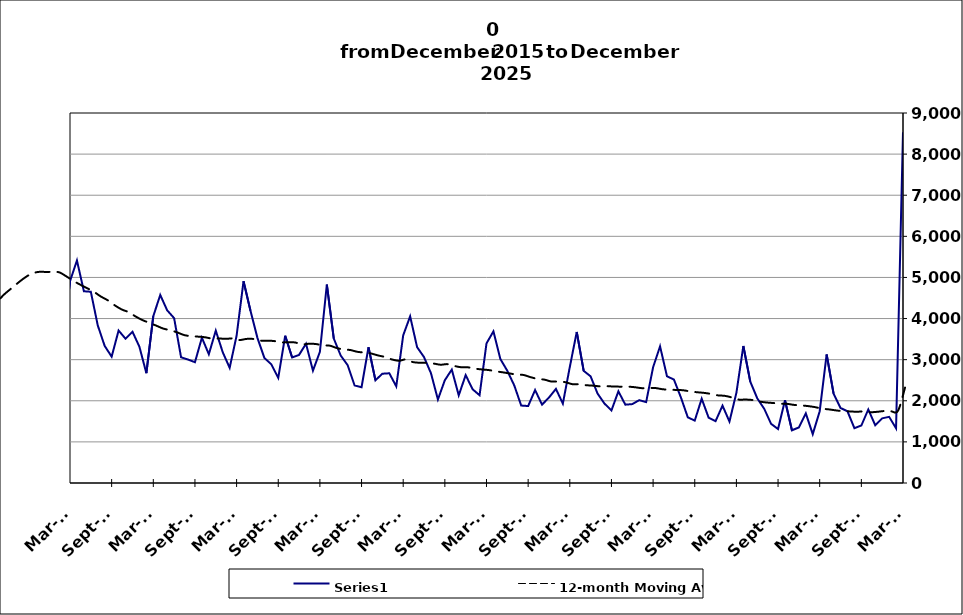
| Category | Series 0 |
|---|---|
| 2005-05-31 | 3131 |
| 2005-06-30 | 2953 |
| 2005-07-31 | 2452 |
| 2005-08-31 | 1842 |
| 2005-09-30 | 1444 |
| 2005-10-31 | 2141 |
| 2005-11-30 | 1626 |
| 2005-12-31 | 1998 |
| 2006-01-31 | 1588 |
| 2006-02-28 | 1445 |
| 2006-03-31 | 1949 |
| 2006-04-30 | 2959 |
| 2006-05-31 | 2381 |
| 2006-06-30 | 2220 |
| 2006-07-31 | 2123 |
| 2006-08-31 | 1525 |
| 2006-09-30 | 1615 |
| 2006-10-31 | 1860 |
| 2006-11-30 | 1507 |
| 2006-12-31 | 1965 |
| 2007-01-31 | 2023 |
| 2007-02-28 | 1616 |
| 2007-03-31 | 2671 |
| 2007-04-30 | 3721 |
| 2007-05-31 | 2286 |
| 2007-06-30 | 3372 |
| 2007-07-30 | 2459 |
| 2007-08-31 | 1980 |
| 2007-09-30 | 2331 |
| 2007-10-31 | 2490 |
| 2007-11-15 | 1970 |
| 2007-12-15 09:36:00 | 2318 |
| 2008-01-14 19:12:00 | 2557 |
| 2008-02-14 04:48:00 | 2676 |
| 2008-03-15 14:24:00 | 3345 |
| 2008-04-15 | 4771 |
| 2008-05-15 09:36:00 | 3529 |
| 2008-06-14 19:12:00 | 4044 |
| 2008-07-15 04:48:00 | 3468 |
| 2008-08-14 14:24:00 | 2936 |
| 2008-09-14 | 3327 |
| 2008-10-14 09:36:00 | 4398 |
| 2008-11-13 19:12:00 | 4288 |
| 2008-12-14 04:48:00 | 4919 |
| 2009-01-13 14:24:00 | 4529 |
| 2009-02-13 | 4588 |
| 2009-03-15 09:36:00 | 6230 |
| 2009-04-14 19:12:00 | 6528 |
| 2009-05-15 04:48:00 | 5710 |
| 2009-06-14 14:24:00 | 5729 |
| 2009-07-15 | 5181 |
| 2009-08-14 09:36:00 | 4471 |
| 2009-09-13 19:12:00 | 4514 |
| 2009-10-14 04:48:00 | 4928 |
| 2009-11-13 14:24:00 | 4288 |
| 2009-12-14 | 4919 |
| 2010-01-13 09:36:00 | 4406 |
| 2010-02-12 19:12:00 | 3451 |
| 2010-03-15 04:48:00 | 4910 |
| 2010-04-14 14:24:00 | 5413 |
| 2010-05-15 | 4664 |
| 2010-06-14 09:36:00 | 4652 |
| 2010-07-14 19:12:00 | 3833 |
| 2010-08-14 04:48:00 | 3333 |
| 2010-09-13 14:24:00 | 3073 |
| 2010-10-14 | 3708 |
| 2010-11-13 09:36:00 | 3510 |
| 2010-12-13 19:12:00 | 3680 |
| 2011-01-13 04:48:00 | 3314 |
| 2011-02-12 14:24:00 | 2671 |
| 2011-03-15 | 4059 |
| 2011-04-14 09:36:00 | 4574 |
| 2011-05-14 19:12:00 | 4200 |
| 2011-06-14 04:48:00 | 4010 |
| 2011-07-14 14:24:00 | 3058 |
| 2011-08-14 | 3003 |
| 2011-09-13 09:36:00 | 2938 |
| 2011-10-13 19:12:00 | 3534 |
| 2011-11-13 04:48:00 | 3132 |
| 2011-12-13 14:24:00 | 3706 |
| 2012-01-13 | 3182 |
| 2012-02-12 09:36:00 | 2802 |
| 2012-03-13 19:12:00 | 3584 |
| 2012-04-13 04:48:00 | 4909 |
| 2012-05-13 14:24:00 | 4188 |
| 2012-06-13 | 3531 |
| 2012-07-13 09:36:00 | 3044 |
| 2012-08-12 19:12:00 | 2885 |
| 2012-09-12 04:48:00 | 2556 |
| 2012-10-12 14:24:00 | 3582 |
| 2012-11-12 | 3054 |
| 2012-12-12 09:36:00 | 3117 |
| 2013-01-11 19:12:00 | 3385 |
| 2013-02-11 04:48:00 | 2732 |
| 2013-03-13 14:24:00 | 3189 |
| 2013-04-13 | 4828 |
| 2013-05-13 09:36:00 | 3513 |
| 2013-06-12 19:12:00 | 3099 |
| 2013-07-13 04:48:00 | 2867 |
| 2013-08-12 14:24:00 | 2371 |
| 2013-09-12 | 2330 |
| 2013-10-12 09:36:00 | 3301 |
| 2013-11-11 19:12:00 | 2499 |
| 2013-12-12 04:48:00 | 2658 |
| 2014-01-11 14:24:00 | 2669 |
| 2014-02-11 | 2351 |
| 2014-03-13 09:36:00 | 3592 |
| 2014-04-12 19:12:00 | 4054 |
| 2014-05-13 04:48:00 | 3305 |
| 2014-06-12 14:24:00 | 3062 |
| 2014-07-13 | 2671 |
| 2014-08-12 09:36:00 | 2031 |
| 2014-09-11 19:12:00 | 2501 |
| 2014-10-12 04:48:00 | 2759 |
| 2014-11-11 14:24:00 | 2132 |
| 2014-12-12 | 2624 |
| 2015-01-11 09:36:00 | 2280 |
| 2015-02-10 19:12:00 | 2135 |
| 2015-03-13 04:48:00 | 3396 |
| 2015-04-12 14:24:00 | 3689 |
| 2015-05-13 | 3015 |
| 2015-06-12 09:36:00 | 2729 |
| 2015-07-12 19:12:00 | 2373 |
| 2015-08-12 04:48:00 | 1884 |
| 2015-09-11 14:24:00 | 1872 |
| 2015-10-12 | 2261 |
| 2015-11-11 09:36:00 | 1906 |
| 2015-12-11 19:12:00 | 2079 |
| 2016-01-11 04:48:00 | 2289 |
| 2016-02-10 14:24:00 | 1931 |
| 2016-03-12 | 2822 |
| 2016-04-11 09:36:00 | 3674 |
| 2016-05-11 19:12:00 | 2728 |
| 2016-06-11 04:48:00 | 2594 |
| 2016-07-11 14:24:00 | 2175 |
| 2016-08-11 | 1931 |
| 2016-09-10 09:36:00 | 1765 |
| 2016-10-10 19:12:00 | 2230 |
| 2016-11-10 04:48:00 | 1905 |
| 2016-12-10 14:24:00 | 1919 |
| 2017-01-10 | 2015 |
| 2017-02-09 09:36:00 | 1968 |
| 2017-03-11 19:12:00 | 2817 |
| 2017-04-11 04:48:00 | 3325 |
| 2017-05-11 14:24:00 | 2596 |
| 2017-06-11 | 2516 |
| 2017-07-11 09:36:00 | 2084 |
| 2017-08-10 19:12:00 | 1597 |
| 2017-09-10 04:48:00 | 1518 |
| 2017-10-10 14:24:00 | 2050 |
| 2017-11-10 | 1589 |
| 2017-12-10 09:36:00 | 1505 |
| 2018-01-09 19:12:00 | 1882 |
| 2018-02-09 04:48:00 | 1495 |
| 2018-03-11 14:24:00 | 2194 |
| 2018-04-11 | 3332 |
| 2018-05-11 09:36:00 | 2466 |
| 2018-06-10 19:12:00 | 2063 |
| 2018-07-11 04:48:00 | 1809 |
| 2018-08-10 14:24:00 | 1440 |
| 2018-09-10 | 1313 |
| 2018-10-10 09:36:00 | 2015 |
| 2018-11-09 19:12:00 | 1282 |
| 2018-12-10 04:48:00 | 1351 |
| 2019-01-09 14:24:00 | 1695 |
| 2019-02-09 | 1189 |
| 2019-03-11 09:36:00 | 1746 |
| 2019-04-10 19:12:00 | 3126 |
| 2019-05-11 04:48:00 | 2174 |
| 2019-06-10 14:24:00 | 1827 |
| 2019-07-11 | 1744 |
| 2019-08-10 09:36:00 | 1335 |
| 2019-09-09 19:12:00 | 1398 |
| 2019-10-10 04:48:00 | 1790 |
| 2019-11-09 14:24:00 | 1407 |
| 2019-12-10 | 1573 |
| 2020-01-09 09:36:00 | 1610 |
| 2020-02-08 19:12:00 | 1333 |
| 2020-03-10 04:48:00 | 8532 |